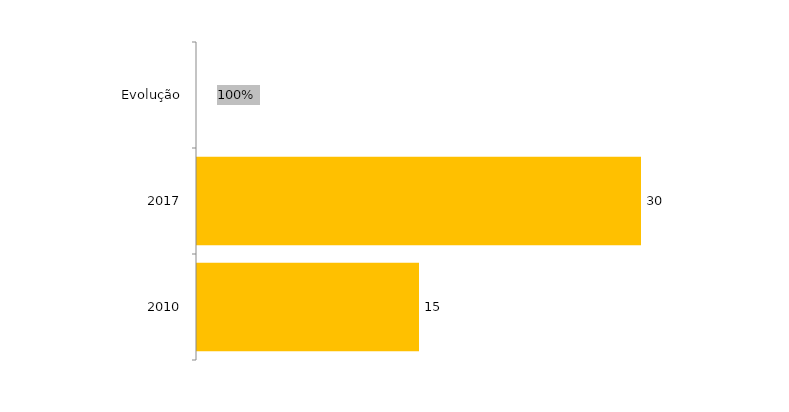
| Category | Evolução Ingressantes |
|---|---|
| 2010 | 15 |
| 2017 | 30 |
| Evolução | 1 |